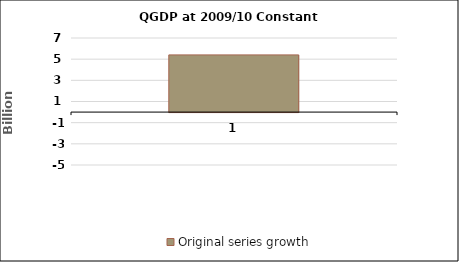
| Category | Original series growth |
|---|---|
| 0 | 5.403 |